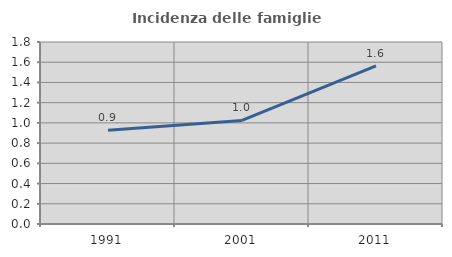
| Category | Incidenza delle famiglie numerose |
|---|---|
| 1991.0 | 0.928 |
| 2001.0 | 1.024 |
| 2011.0 | 1.564 |